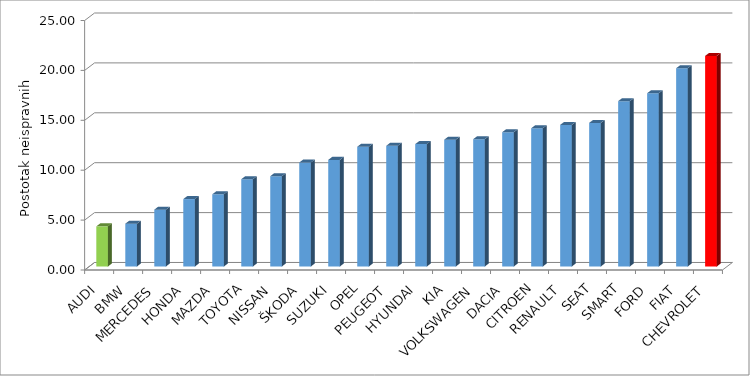
| Category | Series 4 |
|---|---|
| AUDI | 4.021 |
| BMW | 4.293 |
| MERCEDES | 5.697 |
| HONDA | 6.756 |
| MAZDA | 7.235 |
| TOYOTA | 8.748 |
| NISSAN | 9.051 |
| ŠKODA | 10.42 |
| SUZUKI | 10.684 |
| OPEL | 12.002 |
| PEUGEOT | 12.098 |
| HYUNDAI | 12.265 |
| KIA | 12.707 |
| VOLKSWAGEN | 12.76 |
| DACIA | 13.458 |
| CITROEN | 13.853 |
| RENAULT | 14.188 |
| SEAT | 14.391 |
| SMART | 16.567 |
| FORD | 17.363 |
| FIAT | 19.868 |
| CHEVROLET | 21.101 |